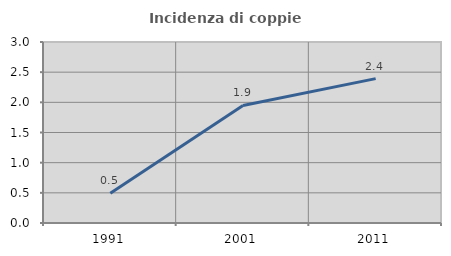
| Category | Incidenza di coppie miste |
|---|---|
| 1991.0 | 0.494 |
| 2001.0 | 1.948 |
| 2011.0 | 2.393 |